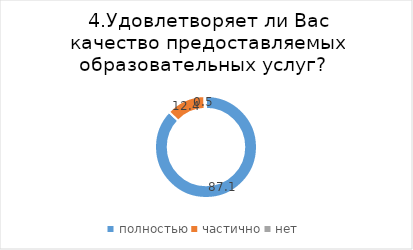
| Category | Series 0 |
|---|---|
| полностью | 87.079 |
| частично | 12.418 |
| нет | 0.503 |